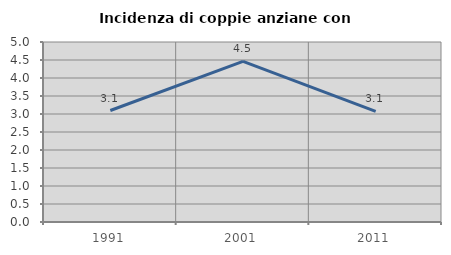
| Category | Incidenza di coppie anziane con figli |
|---|---|
| 1991.0 | 3.097 |
| 2001.0 | 4.461 |
| 2011.0 | 3.07 |